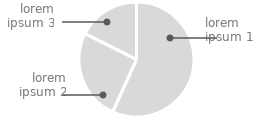
| Category | in million |
|---|---|
| lorem ipsum 1 | 125000 |
| lorem ipsum 2 | 56400 |
| lorem ipsum 3 | 38750 |